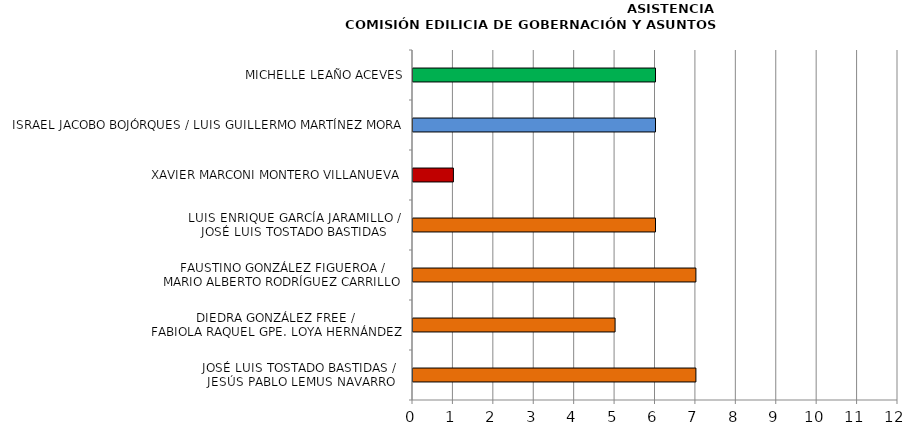
| Category | Series 0 |
|---|---|
| JOSÉ LUIS TOSTADO BASTIDAS / 
JESÚS PABLO LEMUS NAVARRO | 7 |
| DIEDRA GONZÁLEZ FREE / 
FABIOLA RAQUEL GPE. LOYA HERNÁNDEZ | 5 |
| FAUSTINO GONZÁLEZ FIGUEROA /
MARIO ALBERTO RODRÍGUEZ CARRILLO | 7 |
| LUIS ENRIQUE GARCÍA JARAMILLO /
JOSÉ LUIS TOSTADO BASTIDAS | 6 |
| XAVIER MARCONI MONTERO VILLANUEVA | 1 |
| ISRAEL JACOBO BOJÓRQUES / LUIS GUILLERMO MARTÍNEZ MORA | 6 |
| MICHELLE LEAÑO ACEVES | 6 |